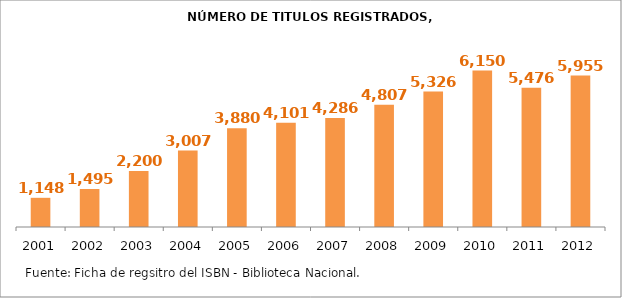
| Category | Series 0 |
|---|---|
| 2001.0 | 1148 |
| 2002.0 | 1495 |
| 2003.0 | 2200 |
| 2004.0 | 3007 |
| 2005.0 | 3880 |
| 2006.0 | 4101 |
| 2007.0 | 4286 |
| 2008.0 | 4807 |
| 2009.0 | 5326 |
| 2010.0 | 6150 |
| 2011.0 | 5476 |
| 2012.0 | 5955 |